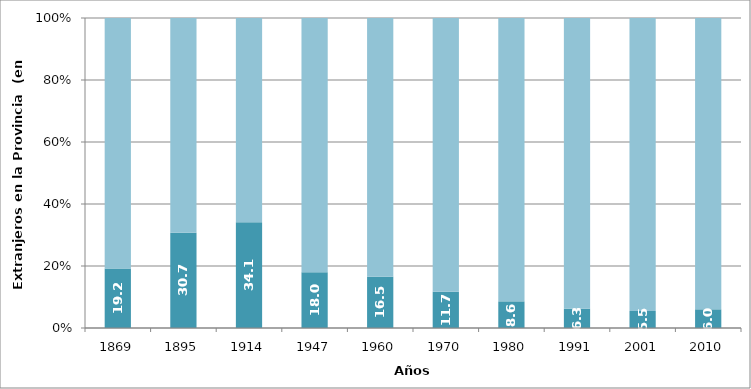
| Category | Extranjeros | Nativos |
|---|---|---|
| 1869.0 | 19.196 | 80.804 |
| 1895.0 | 30.7 | 69.3 |
| 1914.0 | 34.1 | 65.9 |
| 1947.0 | 18 | 82 |
| 1960.0 | 16.5 | 83.5 |
| 1970.0 | 11.7 | 88.3 |
| 1980.0 | 8.6 | 91.4 |
| 1991.0 | 6.266 | 93.734 |
| 2001.0 | 5.487 | 94.513 |
| 2010.0 | 6.028 | 93.972 |